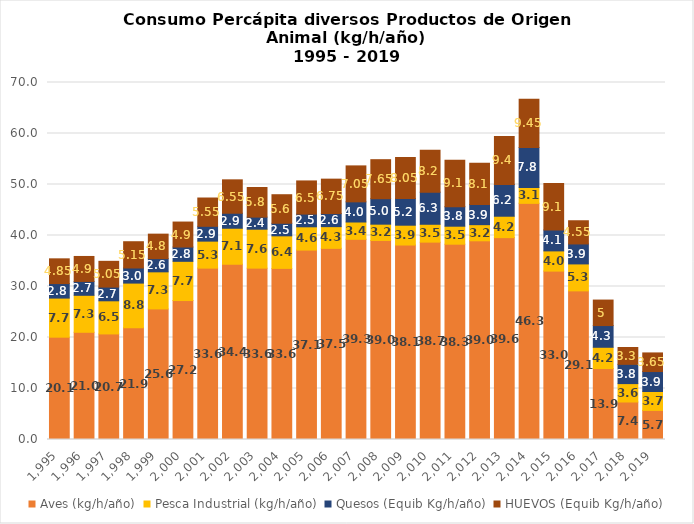
| Category | Aves (kg/h/año) | Pesca Industrial (kg/h/año) | Quesos (Equib Kg/h/año) | HUEVOS (Equib Kg/h/año) |
|---|---|---|---|---|
| 1995.0 | 20.063 | 7.665 | 2.847 | 4.85 |
| 1996.0 | 21.022 | 7.251 | 2.717 | 4.9 |
| 1997.0 | 20.698 | 6.497 | 2.691 | 5.05 |
| 1998.0 | 21.898 | 8.769 | 2.963 | 5.15 |
| 1999.0 | 25.604 | 7.271 | 2.591 | 4.8 |
| 2000.0 | 27.244 | 7.692 | 2.801 | 4.9 |
| 2001.0 | 33.603 | 5.292 | 2.906 | 5.55 |
| 2002.0 | 34.364 | 7.058 | 2.942 | 6.55 |
| 2003.0 | 33.602 | 7.632 | 2.373 | 5.8 |
| 2004.0 | 33.552 | 6.383 | 2.463 | 5.6 |
| 2005.0 | 37.14 | 4.565 | 2.494 | 6.5 |
| 2006.0 | 37.479 | 4.259 | 2.562 | 6.75 |
| 2007.0 | 39.252 | 3.395 | 3.953 | 7.05 |
| 2008.0 | 39.03 | 3.193 | 4.994 | 7.65 |
| 2009.0 | 38.132 | 3.887 | 5.234 | 8.05 |
| 2010.0 | 38.7 | 3.503 | 6.3 | 8.2 |
| 2011.0 | 38.295 | 3.528 | 3.835 | 9.1 |
| 2012.0 | 38.962 | 3.164 | 3.938 | 8.1 |
| 2013.0 | 39.585 | 4.194 | 6.239 | 9.4 |
| 2014.0 | 46.303 | 3.111 | 7.847 | 9.45 |
| 2015.0 | 33.018 | 3.964 | 4.102 | 9.1 |
| 2016.0 | 29.142 | 5.285 | 3.916 | 4.55 |
| 2017.0 | 13.909 | 4.174 | 4.257 | 5 |
| 2018.0 | 7.353 | 3.607 | 3.777 | 3.3 |
| 2019.0 | 5.703 | 3.711 | 3.912 | 3.65 |